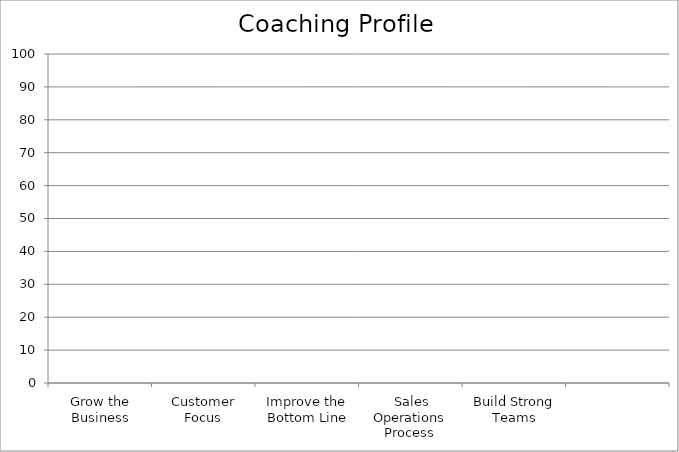
| Category | Series 0 |
|---|---|
| Grow the Business | 0 |
| Customer Focus | 0 |
| Improve the Bottom Line | 0 |
|  Sales Operations Process | 0 |
| Build Strong Teams | 0 |